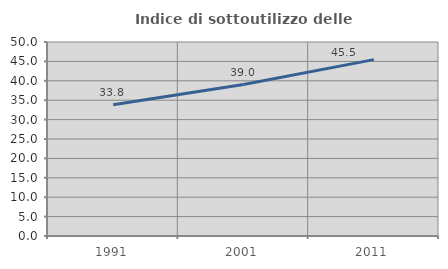
| Category | Indice di sottoutilizzo delle abitazioni  |
|---|---|
| 1991.0 | 33.827 |
| 2001.0 | 39.028 |
| 2011.0 | 45.461 |